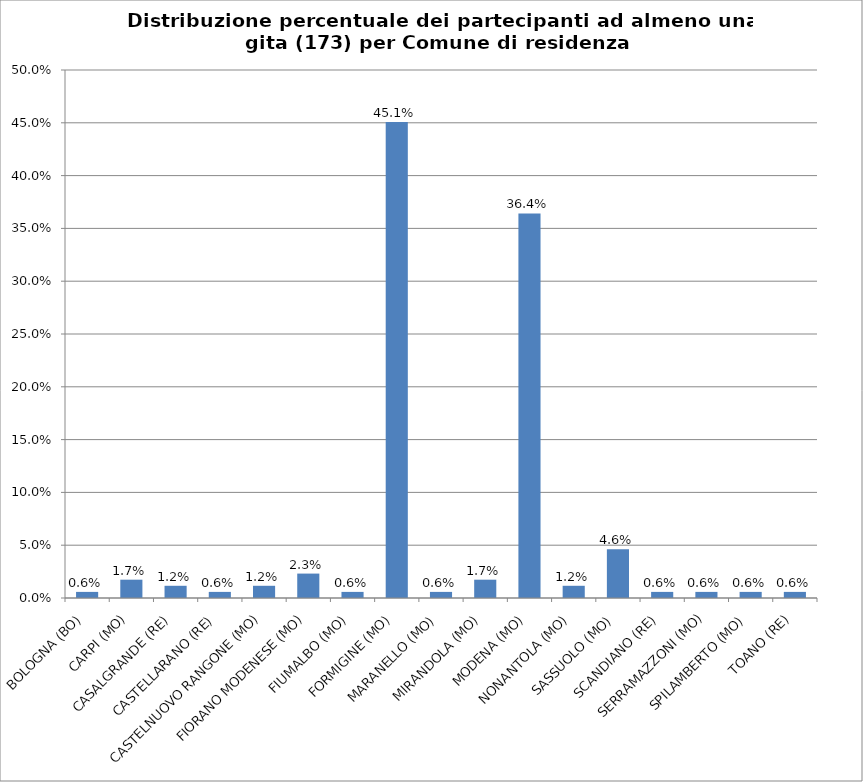
| Category | % Tesserati |
|---|---|
| BOLOGNA (BO) | 0.006 |
| CARPI (MO) | 0.017 |
| CASALGRANDE (RE) | 0.012 |
| CASTELLARANO (RE) | 0.006 |
| CASTELNUOVO RANGONE (MO) | 0.012 |
| FIORANO MODENESE (MO) | 0.023 |
| FIUMALBO (MO) | 0.006 |
| FORMIGINE (MO) | 0.451 |
| MARANELLO (MO) | 0.006 |
| MIRANDOLA (MO) | 0.017 |
| MODENA (MO) | 0.364 |
| NONANTOLA (MO) | 0.012 |
| SASSUOLO (MO) | 0.046 |
| SCANDIANO (RE) | 0.006 |
| SERRAMAZZONI (MO) | 0.006 |
| SPILAMBERTO (MO) | 0.006 |
| TOANO (RE) | 0.006 |